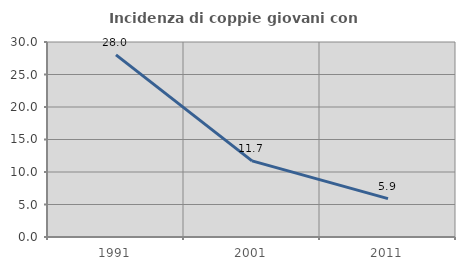
| Category | Incidenza di coppie giovani con figli |
|---|---|
| 1991.0 | 28.014 |
| 2001.0 | 11.718 |
| 2011.0 | 5.909 |